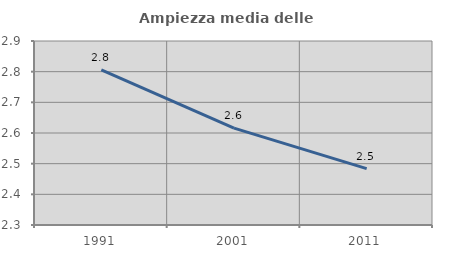
| Category | Ampiezza media delle famiglie |
|---|---|
| 1991.0 | 2.806 |
| 2001.0 | 2.616 |
| 2011.0 | 2.484 |